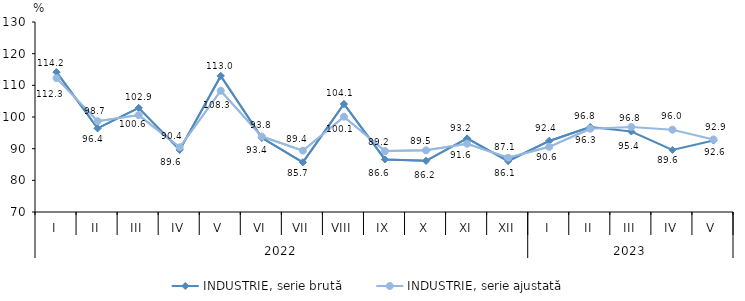
| Category | INDUSTRIE, serie brută | INDUSTRIE, serie ajustată |
|---|---|---|
| 0 | 114.151 | 112.283 |
| 1 | 96.419 | 98.68 |
| 2 | 102.886 | 100.594 |
| 3 | 89.614 | 90.447 |
| 4 | 112.973 | 108.294 |
| 5 | 93.417 | 93.82 |
| 6 | 85.678 | 89.372 |
| 7 | 104.099 | 100.102 |
| 8 | 86.603 | 89.228 |
| 9 | 86.164 | 89.466 |
| 10 | 93.241 | 91.558 |
| 11 | 86.103 | 87.134 |
| 12 | 92.442 | 90.58 |
| 13 | 96.83 | 96.297 |
| 14 | 95.412 | 96.841 |
| 15 | 89.583 | 95.998 |
| 16 | 92.581 | 92.901 |